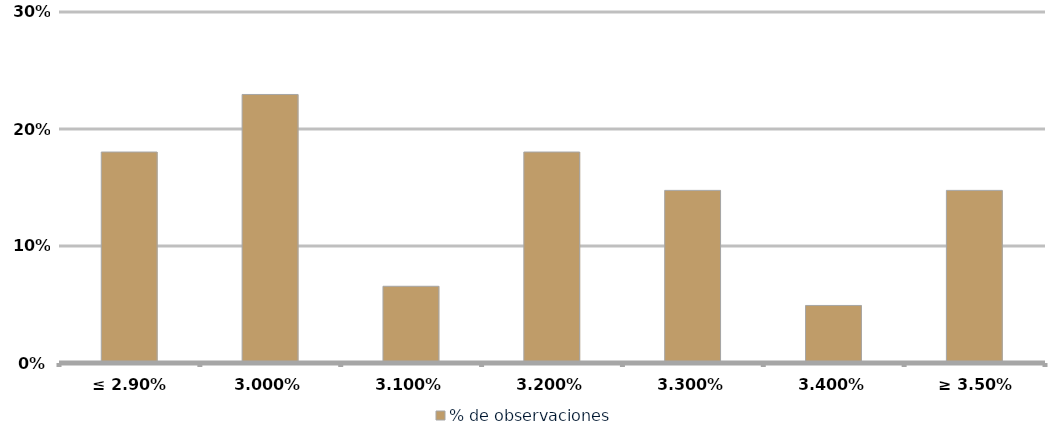
| Category | % de observaciones  |
|---|---|
| ≤ 2.90% | 0.18 |
| 3.00% | 0.23 |
| 3.10% | 0.066 |
| 3.20% | 0.18 |
| 3.30% | 0.148 |
| 3.40% | 0.049 |
| ≥ 3.50% | 0.148 |